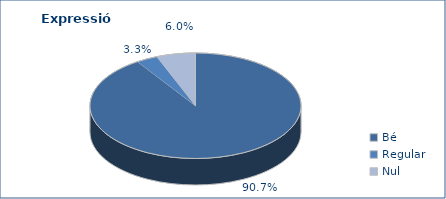
| Category | Series 0 |
|---|---|
| Bé | 5079 |
| Regular | 184 |
| Nul | 334 |